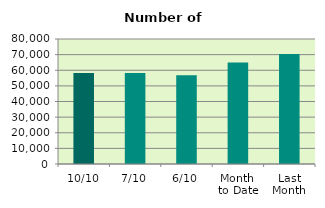
| Category | Series 0 |
|---|---|
| 10/10 | 58238 |
| 7/10 | 58290 |
| 6/10 | 56866 |
| Month 
to Date | 64941.667 |
| Last
Month | 70459.909 |